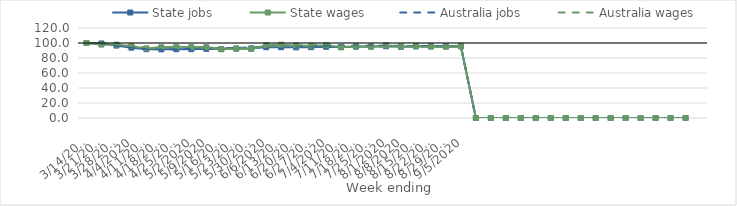
| Category | State jobs | State wages | Australia jobs | Australia wages |
|---|---|---|---|---|
| 14/03/2020 | 100 | 100 | 100 | 100 |
| 21/03/2020 | 99.378 | 97.93 | 99.287 | 99.672 |
| 28/03/2020 | 96.565 | 97.904 | 96.324 | 98.416 |
| 04/04/2020 | 93.785 | 95.81 | 93.668 | 96.718 |
| 11/04/2020 | 91.755 | 92.809 | 91.934 | 94.131 |
| 18/04/2020 | 91.51 | 94.302 | 91.469 | 94.023 |
| 25/04/2020 | 91.678 | 95.011 | 91.796 | 94.249 |
| 02/05/2020 | 91.699 | 94.518 | 92.192 | 94.719 |
| 09/05/2020 | 92.275 | 94.529 | 92.74 | 93.349 |
| 16/05/2020 | 91.931 | 91.635 | 93.27 | 92.686 |
| 23/05/2020 | 92.553 | 92.598 | 93.57 | 92.302 |
| 30/05/2020 | 92.86 | 92.14 | 94.082 | 93.6 |
| 06/06/2020 | 94.416 | 97.074 | 94.995 | 95.373 |
| 13/06/2020 | 94.396 | 97.647 | 95.458 | 96.064 |
| 20/06/2020 | 94.224 | 96.726 | 95.654 | 96.971 |
| 27/06/2020 | 94.41 | 96.36 | 95.59 | 97.092 |
| 04/07/2020 | 94.924 | 96.93 | 96.269 | 98.79 |
| 11/07/2020 | 94.83 | 94.187 | 96.518 | 95.694 |
| 18/07/2020 | 95.062 | 95.827 | 96.375 | 95.102 |
| 25/07/2020 | 95.225 | 95.027 | 96.44 | 94.758 |
| 01/08/2020 | 95.648 | 96.838 | 96.466 | 95.35 |
| 08/08/2020 | 94.954 | 95.374 | 96.196 | 95.604 |
| 15/08/2020 | 95.45 | 96.107 | 96.048 | 95.29 |
| 22/08/2020 | 95.519 | 95.232 | 95.872 | 94.881 |
| 29/08/2020 | 95.426 | 95.087 | 95.598 | 94.692 |
| 05/09/2020 | 95.723 | 95.527 | 95.533 | 95.73 |